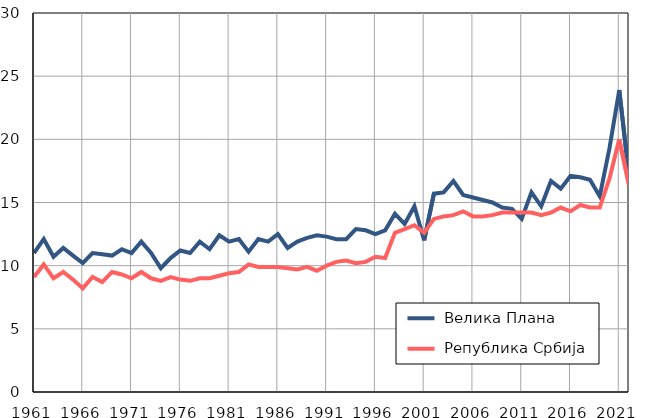
| Category |  Велика Плана |  Република Србија |
|---|---|---|
| 1961.0 | 11 | 9.1 |
| 1962.0 | 12.1 | 10.1 |
| 1963.0 | 10.7 | 9 |
| 1964.0 | 11.4 | 9.5 |
| 1965.0 | 10.8 | 8.9 |
| 1966.0 | 10.2 | 8.2 |
| 1967.0 | 11 | 9.1 |
| 1968.0 | 10.9 | 8.7 |
| 1969.0 | 10.8 | 9.5 |
| 1970.0 | 11.3 | 9.3 |
| 1971.0 | 11 | 9 |
| 1972.0 | 11.9 | 9.5 |
| 1973.0 | 11 | 9 |
| 1974.0 | 9.8 | 8.8 |
| 1975.0 | 10.6 | 9.1 |
| 1976.0 | 11.2 | 8.9 |
| 1977.0 | 11 | 8.8 |
| 1978.0 | 11.9 | 9 |
| 1979.0 | 11.3 | 9 |
| 1980.0 | 12.4 | 9.2 |
| 1981.0 | 11.9 | 9.4 |
| 1982.0 | 12.1 | 9.5 |
| 1983.0 | 11.1 | 10.1 |
| 1984.0 | 12.1 | 9.9 |
| 1985.0 | 11.9 | 9.9 |
| 1986.0 | 12.5 | 9.9 |
| 1987.0 | 11.4 | 9.8 |
| 1988.0 | 11.9 | 9.7 |
| 1989.0 | 12.2 | 9.9 |
| 1990.0 | 12.4 | 9.6 |
| 1991.0 | 12.3 | 10 |
| 1992.0 | 12.1 | 10.3 |
| 1993.0 | 12.1 | 10.4 |
| 1994.0 | 12.9 | 10.2 |
| 1995.0 | 12.8 | 10.3 |
| 1996.0 | 12.5 | 10.7 |
| 1997.0 | 12.8 | 10.6 |
| 1998.0 | 14.1 | 12.6 |
| 1999.0 | 13.3 | 12.9 |
| 2000.0 | 14.7 | 13.2 |
| 2001.0 | 12 | 12.6 |
| 2002.0 | 15.7 | 13.7 |
| 2003.0 | 15.8 | 13.9 |
| 2004.0 | 16.7 | 14 |
| 2005.0 | 15.6 | 14.3 |
| 2006.0 | 15.4 | 13.9 |
| 2007.0 | 15.2 | 13.9 |
| 2008.0 | 15 | 14 |
| 2009.0 | 14.6 | 14.2 |
| 2010.0 | 14.5 | 14.2 |
| 2011.0 | 13.7 | 14.2 |
| 2012.0 | 15.8 | 14.2 |
| 2013.0 | 14.7 | 14 |
| 2014.0 | 16.7 | 14.2 |
| 2015.0 | 16.1 | 14.6 |
| 2016.0 | 17.1 | 14.3 |
| 2017.0 | 17 | 14.8 |
| 2018.0 | 16.8 | 14.6 |
| 2019.0 | 15.5 | 14.6 |
| 2020.0 | 19.3 | 16.9 |
| 2021.0 | 23.9 | 20 |
| 2022.0 | 17.1 | 16.4 |